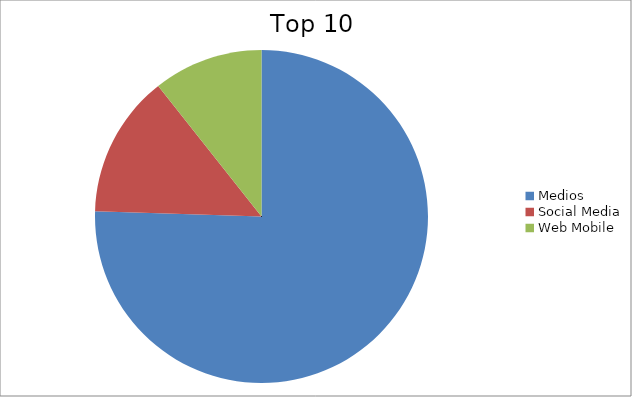
| Category | Series 0 |
|---|---|
| Medios | 75.51 |
| Social Media | 13.84 |
| Web Mobile | 10.65 |